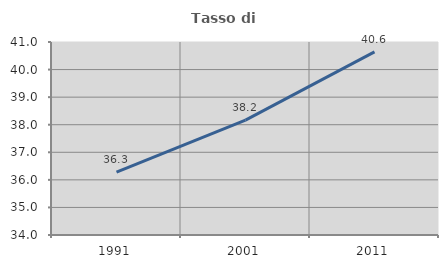
| Category | Tasso di occupazione   |
|---|---|
| 1991.0 | 36.277 |
| 2001.0 | 38.164 |
| 2011.0 | 40.642 |